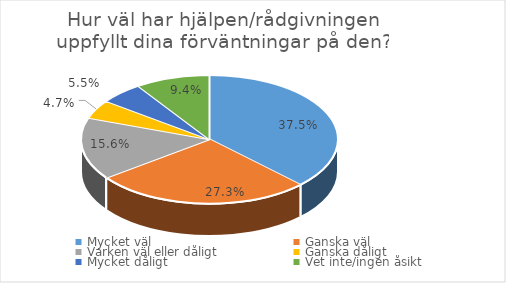
| Category | Series 0 |
|---|---|
| Mycket väl | 0.375 |
| Ganska väl | 0.273 |
| Varken väl eller dåligt | 0.156 |
| Ganska dåligt  | 0.047 |
| Mycket dåligt  | 0.055 |
| Vet inte/ingen åsikt | 0.094 |